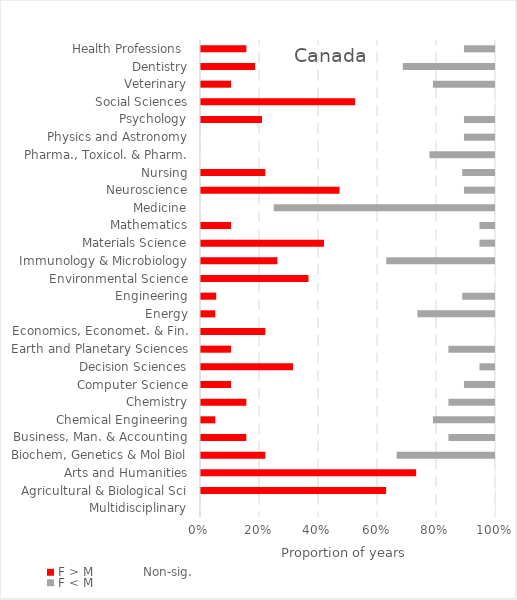
| Category | F > M | Non-sig. | F < M |
|---|---|---|---|
| Multidisciplinary | 0 | 18 | 0 |
| Agricultural & Biological Sci | 12 | 7 | 0 |
| Arts and Humanities | 11 | 4 | 0 |
| Biochem, Genetics & Mol Biol | 4 | 8 | 6 |
| Business, Man. & Accounting | 3 | 13 | 3 |
| Chemical Engineering | 1 | 14 | 4 |
| Chemistry | 3 | 13 | 3 |
| Computer Science | 2 | 15 | 2 |
| Decision Sciences | 6 | 12 | 1 |
| Earth and Planetary Sciences | 2 | 14 | 3 |
| Economics, Economet. & Fin. | 4 | 14 | 0 |
| Energy | 1 | 13 | 5 |
| Engineering | 1 | 15 | 2 |
| Environmental Science | 7 | 12 | 0 |
| Immunology & Microbiology | 5 | 7 | 7 |
| Materials Science | 8 | 10 | 1 |
| Mathematics | 2 | 16 | 1 |
| Medicine | 0 | 1 | 3 |
| Neuroscience | 9 | 8 | 2 |
| Nursing | 4 | 12 | 2 |
| Pharma., Toxicol. & Pharm. | 0 | 14 | 4 |
| Physics and Astronomy | 0 | 17 | 2 |
| Psychology | 4 | 13 | 2 |
| Social Sciences | 10 | 9 | 0 |
| Veterinary | 2 | 13 | 4 |
| Dentistry | 3 | 8 | 5 |
| Health Professions  | 3 | 14 | 2 |